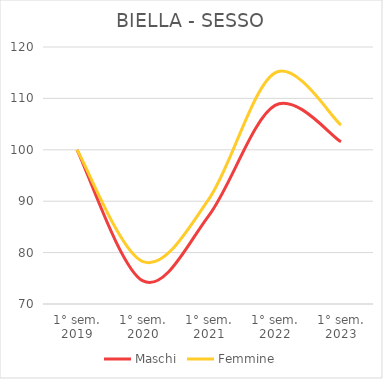
| Category | Maschi | Femmine |
|---|---|---|
| 1° sem.
2019 | 100 | 100 |
| 1° sem.
2020 | 74.482 | 78.244 |
| 1° sem.
2021 | 87.261 | 90.469 |
| 1° sem.
2022 | 108.636 | 114.97 |
| 1° sem.
2023 | 101.563 | 104.817 |